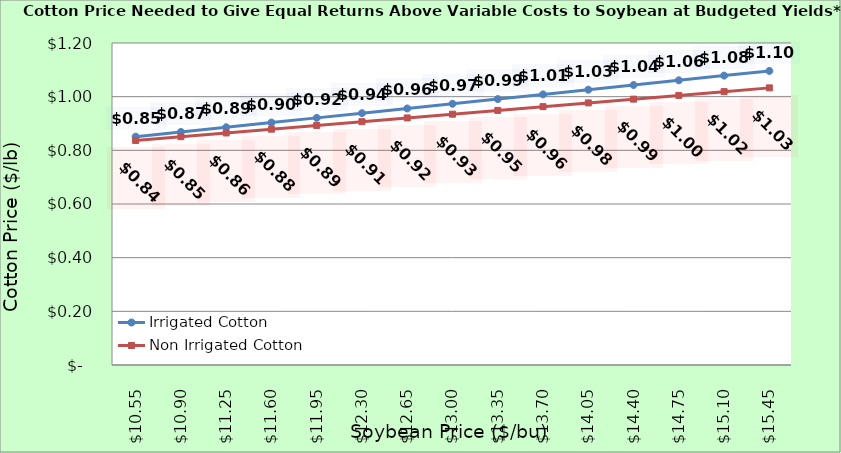
| Category | Irrigated Cotton | Non Irrigated Cotton |
|---|---|---|
| 10.550000000000002 | 0.851 | 0.837 |
| 10.900000000000002 | 0.868 | 0.851 |
| 11.250000000000002 | 0.886 | 0.865 |
| 11.600000000000001 | 0.903 | 0.879 |
| 11.950000000000001 | 0.921 | 0.893 |
| 12.3 | 0.938 | 0.907 |
| 12.65 | 0.956 | 0.921 |
| 13.0 | 0.973 | 0.935 |
| 13.35 | 0.991 | 0.949 |
| 13.7 | 1.008 | 0.963 |
| 14.049999999999999 | 1.026 | 0.977 |
| 14.399999999999999 | 1.043 | 0.991 |
| 14.749999999999998 | 1.061 | 1.005 |
| 15.099999999999998 | 1.078 | 1.019 |
| 15.449999999999998 | 1.096 | 1.033 |